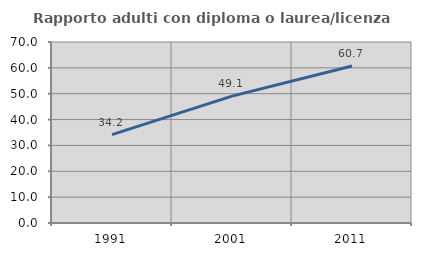
| Category | Rapporto adulti con diploma o laurea/licenza media  |
|---|---|
| 1991.0 | 34.152 |
| 2001.0 | 49.071 |
| 2011.0 | 60.708 |